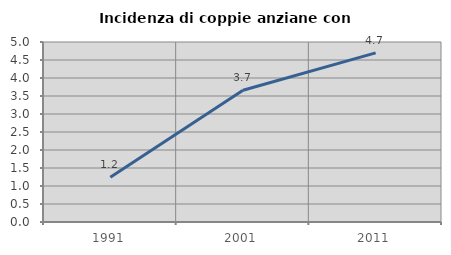
| Category | Incidenza di coppie anziane con figli |
|---|---|
| 1991.0 | 1.246 |
| 2001.0 | 3.659 |
| 2011.0 | 4.699 |